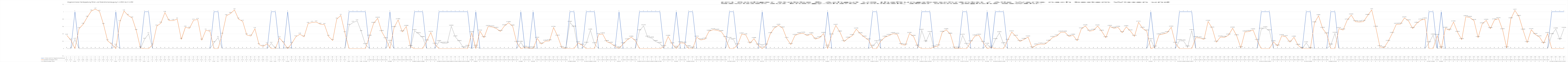
| Category | 1 =Strom reicht im Tagesdurchschnitt aus | Zusätzlich benötigter Strom | Überschüssiger Strom |
|---|---|---|---|
| 0 | 0 | 0.36 | 0 |
| 1 | 0 | 0.23 | 0 |
| 2 | 1 | 0 | 0.25 |
| 3 | 0 | 0.54 | 0 |
| 4 | 0 | 0.66 | 0 |
| 5 | 0 | 0.85 | 0 |
| 6 | 0 | 1.02 | 0 |
| 7 | 0 | 1.07 | 0 |
| 8 | 0 | 1.01 | 0 |
| 9 | 0 | 0.65 | 0 |
| 10 | 0 | 0.21 | 0 |
| 11 | 0 | 0.12 | 0 |
| 12 | 1 | 0 | 0.09 |
| 13 | 0 | 0.73 | 0 |
| 14 | 0 | 1.02 | 0 |
| 15 | 0 | 0.9 | 0 |
| 16 | 0 | 0.83 | 0 |
| 17 | 0 | 0.49 | 0 |
| 18 | 0 | 0.02 | 0 |
| 19 | 1 | 0 | 0.25 |
| 20 | 1 | 0 | 0.4 |
| 21 | 0 | 0.1 | 0 |
| 22 | 0 | 0.61 | 0 |
| 23 | 0 | 0.69 | 0 |
| 24 | 0 | 0.98 | 0 |
| 25 | 0 | 0.76 | 0 |
| 26 | 0 | 0.76 | 0 |
| 27 | 0 | 0.8 | 0 |
| 28 | 0 | 0.25 | 0 |
| 29 | 0 | 0.58 | 0 |
| 30 | 0 | 0.55 | 0 |
| 31 | 0 | 0.77 | 0 |
| 32 | 0 | 0.79 | 0 |
| 33 | 0 | 0.23 | 0 |
| 34 | 0 | 0.5 | 0 |
| 35 | 0 | 0.47 | 0 |
| 36 | 1 | 0 | 0.16 |
| 37 | 1 | 0 | 0.3 |
| 38 | 0 | 0.39 | 0 |
| 39 | 0 | 0.89 | 0 |
| 40 | 0 | 0.95 | 0 |
| 41 | 0 | 1.05 | 0 |
| 42 | 0 | 0.8 | 0 |
| 43 | 0 | 0.74 | 0 |
| 44 | 0 | 0.37 | 0 |
| 45 | 0 | 0.34 | 0 |
| 46 | 0 | 0.54 | 0 |
| 47 | 0 | 0.11 | 0 |
| 48 | 0 | 0.06 | 0 |
| 49 | 0 | 0.13 | 0 |
| 50 | 1 | 0 | 0.14 |
| 51 | 1 | 0 | 0.01 |
| 52 | 0 | 0.29 | 0 |
| 53 | 0 | 0.16 | 0 |
| 54 | 1 | 0 | 0 |
| 55 | 0 | 0.14 | 0 |
| 56 | 0 | 0.32 | 0 |
| 57 | 0 | 0.39 | 0 |
| 58 | 0 | 0.32 | 0 |
| 59 | 0 | 0.68 | 0 |
| 60 | 0 | 0.71 | 0 |
| 61 | 0 | 0.72 | 0 |
| 62 | 0 | 0.66 | 0 |
| 63 | 0 | 0.65 | 0 |
| 64 | 0 | 0.33 | 0 |
| 65 | 0 | 0.22 | 0 |
| 66 | 0 | 0.8 | 0 |
| 67 | 0 | 0.9 | 0 |
| 68 | 0 | 0.43 | 0 |
| 69 | 1 | 0 | 0.63 |
| 70 | 1 | 0 | 0.71 |
| 71 | 1 | 0 | 0.75 |
| 72 | 1 | 0 | 0.46 |
| 73 | 1 | 0 | 0.11 |
| 74 | 0 | 0.335 | 0 |
| 75 | 0 | 0.683 | 0 |
| 76 | 0 | 0.822 | 0 |
| 77 | 0 | 0.459 | 0 |
| 78 | 0 | 0.265 | 0 |
| 79 | 1 | 0 | 0.195 |
| 80 | 0 | 0.568 | 0 |
| 81 | 0 | 0.78 | 0 |
| 82 | 0 | 0.454 | 0 |
| 83 | 0 | 0.6 | 0 |
| 84 | 0 | 0.055 | 0 |
| 85 | 1 | 0 | 0.484 |
| 86 | 1 | 0 | 0.402 |
| 87 | 1 | 0 | 0.297 |
| 88 | 0 | 0.206 | 0 |
| 89 | 0 | 0.437 | 0 |
| 90 | 0 | 0.115 | 0 |
| 91 | 1 | 0 | 0.189 |
| 92 | 1 | 0 | 0.142 |
| 93 | 1 | 0 | 0.144 |
| 94 | 1 | 0 | 0.606 |
| 95 | 1 | 0 | 0.315 |
| 96 | 1 | 0 | 0.189 |
| 97 | 1 | 0 | 0.021 |
| 98 | 1 | 0 | 0.059 |
| 99 | 0 | 0.428 | 0 |
| 100 | 1 | 0 | 0.063 |
| 101 | 0 | 0.473 | 0 |
| 102 | 0 | 0.298 | 0 |
| 103 | 0 | 0.597 | 0 |
| 104 | 0 | 0.587 | 0 |
| 105 | 0 | 0.546 | 0 |
| 106 | 0 | 0.465 | 0 |
| 107 | 0 | 0.616 | 0 |
| 108 | 0 | 0.701 | 0 |
| 109 | 0 | 0.61 | 0 |
| 110 | 0 | 0.166 | 0 |
| 111 | 1 | 0 | 0.17 |
| 112 | 0 | 0.034 | 0 |
| 113 | 0 | 0.014 | 0 |
| 114 | 1 | 0 | 0.016 |
| 115 | 0 | 0.277 | 0 |
| 116 | 0 | 0.123 | 0 |
| 117 | 0 | 0.2 | 0 |
| 118 | 0 | 0.21 | 0 |
| 119 | 0 | 0.573 | 0 |
| 120 | 0 | 0.335 | 0 |
| 121 | 0 | 0.028 | 0 |
| 122 | 0 | 0.003 | 0 |
| 123 | 1 | 0 | 0.71 |
| 124 | 1 | 0 | 0.582 |
| 125 | 0 | 0.155 | 0 |
| 126 | 0 | 0.092 | 0 |
| 127 | 1 | 0 | 0.142 |
| 128 | 1 | 0 | 0.5 |
| 129 | 1 | 0 | 0.131 |
| 130 | 0 | 0.379 | 0 |
| 131 | 0 | 0.395 | 0 |
| 132 | 0 | 0.188 | 0 |
| 133 | 0 | 0.143 | 0 |
| 134 | 0 | 0.064 | 0 |
| 135 | 1 | 0 | 0.021 |
| 136 | 0 | 0.129 | 0 |
| 137 | 0 | 0.236 | 0 |
| 138 | 0 | 0.309 | 0 |
| 139 | 0 | 0.217 | 0 |
| 140 | 1 | 0 | 0.482 |
| 141 | 1 | 0 | 0.617 |
| 142 | 1 | 0 | 0.307 |
| 143 | 1 | 0 | 0.283 |
| 144 | 1 | 0 | 0.189 |
| 145 | 1 | 0 | 0.138 |
| 146 | 0 | 0.052 | 0 |
| 147 | 0 | 0.329 | 0 |
| 148 | 0 | 0.128 | 0 |
| 149 | 1 | 0 | 0.035 |
| 150 | 0 | 0.156 | 0 |
| 151 | 0 | 0.146 | 0 |
| 152 | 1 | 0 | 0.05 |
| 153 | 1 | 0 | 0.014 |
| 154 | 0 | 0.307 | 0 |
| 155 | 0 | 0.234 | 0 |
| 156 | 0 | 0.255 | 0 |
| 157 | 0 | 0.469 | 0 |
| 158 | 0 | 0.512 | 0 |
| 159 | 0 | 0.495 | 0 |
| 160 | 0 | 0.461 | 0 |
| 161 | 0 | 0.3 | 0 |
| 162 | 1 | 0 | 0.274 |
| 163 | 1 | 0 | 0.243 |
| 164 | 0 | 0.101 | 0 |
| 165 | 0 | 0.393 | 0 |
| 166 | 0 | 0.369 | 0 |
| 167 | 0 | 0.144 | 0 |
| 168 | 0 | 0.27 | 0 |
| 169 | 0 | 0.095 | 0 |
| 170 | 1 | 0 | 0.077 |
| 171 | 0 | 0.095 | 0 |
| 172 | 0 | 0.406 | 0 |
| 173 | 0 | 0.563 | 0 |
| 174 | 0 | 0.63 | 0 |
| 175 | 0 | 0.556 | 0 |
| 176 | 0 | 0.273 | 0 |
| 177 | 0 | 0.11 | 0 |
| 178 | 0 | 0.355 | 0 |
| 179 | 0 | 0.403 | 0 |
| 180 | 0 | 0.415 | 0 |
| 181 | 0 | 0.351 | 0 |
| 182 | 0 | 0.399 | 0 |
| 183 | 0 | 0.258 | 0 |
| 184 | 0 | 0.293 | 0 |
| 185 | 0 | 0.408 | 0 |
| 186 | 1 | 0 | 0.065 |
| 187 | 0 | 0.367 | 0 |
| 188 | 0 | 0.629 | 0 |
| 189 | 0 | 0.448 | 0 |
| 190 | 0 | 0.191 | 0 |
| 191 | 0 | 0.281 | 0 |
| 192 | 0 | 0.35 | 0 |
| 193 | 0 | 0.528 | 0 |
| 194 | 0 | 0.402 | 0 |
| 195 | 0 | 0.31 | 0 |
| 196 | 0 | 0.235 | 0 |
| 197 | 1 | 0 | 0.063 |
| 198 | 1 | 0 | 0.187 |
| 199 | 0 | 0.206 | 0 |
| 200 | 0 | 0.309 | 0 |
| 201 | 0 | 0.354 | 0 |
| 202 | 0 | 0.404 | 0 |
| 203 | 0 | 0.388 | 0 |
| 204 | 0 | 0.11 | 0 |
| 205 | 0 | 0.093 | 0 |
| 206 | 0 | 0.41 | 0 |
| 207 | 0 | 0.329 | 0 |
| 208 | 0 | 0.066 | 0 |
| 209 | 1 | 0 | 0.493 |
| 210 | 1 | 0 | 0.182 |
| 211 | 1 | 0 | 0.433 |
| 212 | 0 | 0.042 | 0 |
| 213 | 0 | 0.071 | 0 |
| 214 | 0 | 0.441 | 0 |
| 215 | 0 | 0.51 | 0 |
| 216 | 0 | 0.389 | 0 |
| 217 | 0 | 0.012 | 0 |
| 218 | 0 | 0.011 | 0 |
| 219 | 1 | 0 | 0.358 |
| 220 | 1 | 0 | 0.112 |
| 221 | 0 | 0.184 | 0 |
| 222 | 0 | 0.34 | 0 |
| 223 | 0 | 0.36 | 0 |
| 224 | 0 | 0.168 | 0 |
| 225 | 1 | 0 | 0.116 |
| 226 | 0 | 0.036 | 0 |
| 227 | 1 | 0 | 0.242 |
| 228 | 1 | 0 | 0.43 |
| 229 | 1 | 0 | 0.129 |
| 230 | 0 | 0.223 | 0 |
| 231 | 0 | 0.451 | 0 |
| 232 | 0 | 0.331 | 0 |
| 233 | 0 | 0.194 | 0 |
| 234 | 0 | 0.249 | 0 |
| 235 | 0 | 0.314 | 0 |
| 236 | 0 | 0.019 | 0 |
| 237 | 0 | 0.095 | 0 |
| 238 | 0 | 0.122 | 0 |
| 239 | 0 | 0.118 | 0 |
| 240 | 0 | 0.198 | 0 |
| 241 | 0 | 0.302 | 0 |
| 242 | 0 | 0.341 | 0 |
| 243 | 0 | 0.444 | 0 |
| 244 | 0 | 0.445 | 0 |
| 245 | 0 | 0.329 | 0 |
| 246 | 0 | 0.361 | 0 |
| 247 | 0 | 0.216 | 0 |
| 248 | 0 | 0.534 | 0 |
| 249 | 0 | 0.615 | 0 |
| 250 | 0 | 0.472 | 0 |
| 251 | 0 | 0.495 | 0 |
| 252 | 0 | 0.613 | 0 |
| 253 | 0 | 0.47 | 0 |
| 254 | 0 | 0.296 | 0 |
| 255 | 0 | 0.6 | 0 |
| 256 | 0 | 0.55 | 0 |
| 257 | 0 | 0.576 | 0 |
| 258 | 0 | 0.432 | 0 |
| 259 | 0 | 0.59 | 0 |
| 260 | 0 | 0.477 | 0 |
| 261 | 0 | 0.331 | 0 |
| 262 | 0 | 0.714 | 0 |
| 263 | 0 | 0.548 | 0 |
| 264 | 0 | 0.476 | 0 |
| 265 | 1 | 0 | 0.242 |
| 266 | 0 | 0.041 | 0 |
| 267 | 0 | 0.369 | 0 |
| 268 | 0 | 0.396 | 0 |
| 269 | 0 | 0.43 | 0 |
| 270 | 0 | 0.579 | 0 |
| 271 | 0 | 0.143 | 0 |
| 272 | 1 | 0 | 0.215 |
| 273 | 1 | 0 | 0.205 |
| 274 | 1 | 0 | 0.042 |
| 275 | 1 | 0 | 0.487 |
| 276 | 0 | 0.297 | 0 |
| 277 | 0 | 0.287 | 0 |
| 278 | 0 | 0.249 | 0 |
| 279 | 0 | 0.736 | 0 |
| 280 | 0 | 0.554 | 0 |
| 281 | 0 | 0.174 | 0 |
| 282 | 0 | 0.313 | 0 |
| 283 | 0 | 0.303 | 0 |
| 284 | 0 | 0.365 | 0 |
| 285 | 0 | 0.552 | 0 |
| 286 | 0 | 0.346 | 0 |
| 287 | 0 | 0.022 | 0 |
| 288 | 0 | 0.449 | 0 |
| 289 | 0 | 0.462 | 0 |
| 290 | 0 | 0.506 | 0 |
| 291 | 0 | 0.219 | 0 |
| 292 | 1 | 0 | 0.525 |
| 293 | 1 | 0 | 0.56 |
| 294 | 1 | 0 | 0.482 |
| 295 | 0 | 0.183 | 0 |
| 296 | 0 | 0.07 | 0 |
| 297 | 0 | 0.347 | 0 |
| 298 | 0 | 0.322 | 0 |
| 299 | 0 | 0.176 | 0 |
| 300 | 0 | 0.307 | 0 |
| 301 | 0 | 0.088 | 0 |
| 302 | 0 | 0.004 | 0 |
| 303 | 1 | 0 | 0.154 |
| 304 | 1 | 0 | 0 |
| 305 | 0 | 0.696 | 0 |
| 306 | 0 | 0.891 | 0 |
| 307 | 0 | 0.545 | 0 |
| 308 | 0 | 0.397 | 0 |
| 309 | 1 | 0 | 0.095 |
| 310 | 1 | 0 | 0.413 |
| 311 | 0 | 0.542 | 0 |
| 312 | 0 | 0.503 | 0 |
| 313 | 0 | 0.771 | 0 |
| 314 | 0 | 0.911 | 0 |
| 315 | 0 | 0.73 | 0 |
| 316 | 0 | 0.72 | 0 |
| 317 | 0 | 0.733 | 0 |
| 318 | 0 | 0.898 | 0 |
| 319 | 0 | 1.051 | 0 |
| 320 | 0 | 0.577 | 0 |
| 321 | 0 | 0.051 | 0 |
| 322 | 0 | 0.022 | 0 |
| 323 | 0 | 0.193 | 0 |
| 324 | 0 | 0.41 | 0 |
| 325 | 0 | 0.658 | 0 |
| 326 | 0 | 0.661 | 0 |
| 327 | 0 | 0.832 | 0 |
| 328 | 0 | 0.752 | 0 |
| 329 | 0 | 0.544 | 0 |
| 330 | 0 | 0.686 | 0 |
| 331 | 0 | 0.772 | 0 |
| 332 | 0 | 0.8 | 0 |
| 333 | 1 | 0 | 0.157 |
| 334 | 1 | 0 | 0.366 |
| 335 | 0 | 0.354 | 0 |
| 336 | 1 | 0 | 0.028 |
| 337 | 0 | 0.549 | 0 |
| 338 | 0 | 0.499 | 0 |
| 339 | 0 | 0.721 | 0 |
| 340 | 0 | 0.439 | 0 |
| 341 | 0 | 0.244 | 0 |
| 342 | 0 | 0.864 | 0 |
| 343 | 0 | 0.844 | 0 |
| 344 | 0 | 0.761 | 0 |
| 345 | 0 | 0.299 | 0 |
| 346 | 0 | 0.67 | 0 |
| 347 | 0 | 0.765 | 0 |
| 348 | 0 | 0.541 | 0 |
| 349 | 0 | 0.777 | 0 |
| 350 | 0 | 0.811 | 0 |
| 351 | 0 | 0.508 | 0 |
| 352 | 0 | 0.018 | 0 |
| 353 | 0 | 0.807 | 0 |
| 354 | 0 | 1.038 | 0 |
| 355 | 0 | 0.868 | 0 |
| 356 | 0 | 0.5 | 0 |
| 357 | 0 | 0.163 | 0 |
| 358 | 0 | 0.513 | 0 |
| 359 | 0 | 0.382 | 0 |
| 360 | 0 | 0.317 | 0 |
| 361 | 0 | 0.141 | 0 |
| 362 | 0 | 0.407 | 0 |
| 363 | 1 | 0 | 0.376 |
| 364 | 1 | 0 | 0.531 |
| 365 | 1 | 0 | 0.241 |
| 366 | 1 | 0 | 0.543 |